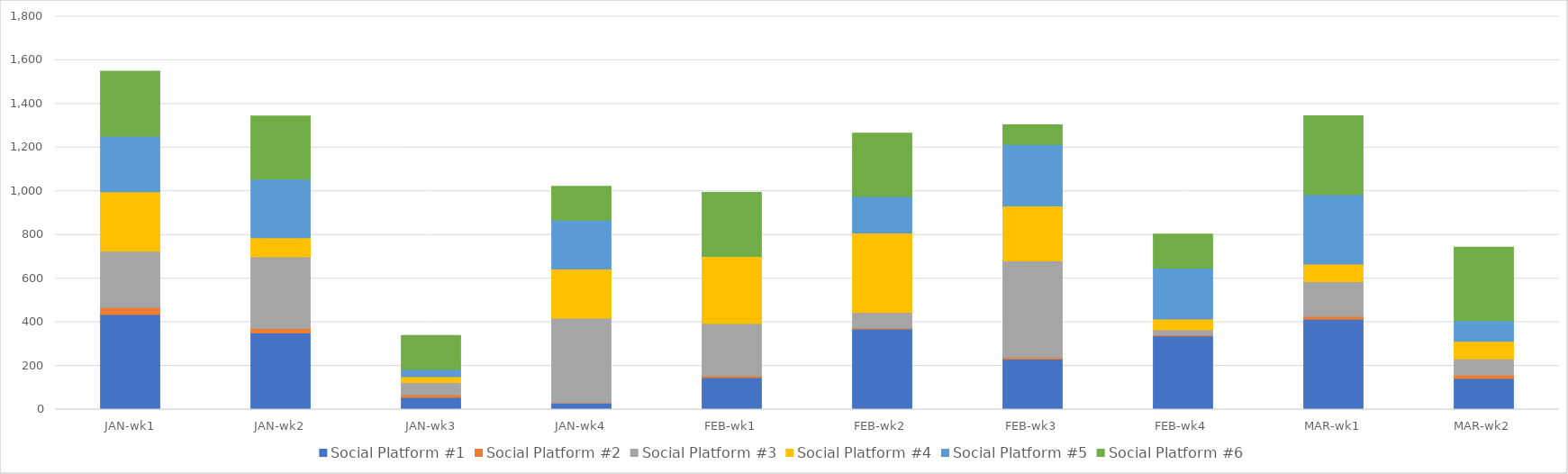
| Category | Social Platform #1 | Social Platform #2 | Social Platform #3 | Social Platform #4 | Social Platform #5 | Social Platform #6 |
|---|---|---|---|---|---|---|
| JAN-wk1 | 436 | 32 | 258 | 272 | 254 | 298 |
| JAN-wk2 | 351 | 21 | 328 | 88 | 268 | 289 |
| JAN-wk3 | 56 | 12 | 56 | 27 | 33 | 156 |
| JAN-wk4 | 30 | 1 | 388 | 225 | 224 | 155 |
| FEB-wk1 | 147 | 8 | 239 | 308 | 0 | 293 |
| FEB-wk2 | 369 | 5 | 71 | 364 | 167 | 290 |
| FEB-wk3 | 231 | 8 | 442 | 252 | 282 | 90 |
| FEB-wk4 | 338 | 4 | 23 | 50 | 233 | 156 |
| MAR-wk1 | 414 | 13 | 159 | 81 | 318 | 361 |
| MAR-wk2 | 142 | 17 | 73 | 81 | 94 | 337 |